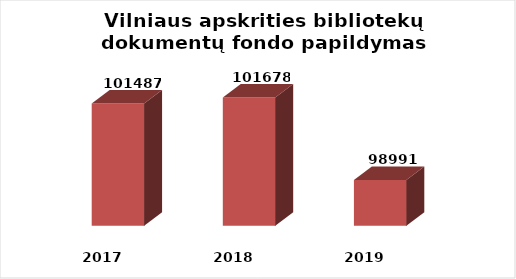
| Category | Series 0 |
|---|---|
| 2017.0 | 101487 |
| 2018.0 | 101678 |
| 2019.0 | 98991 |